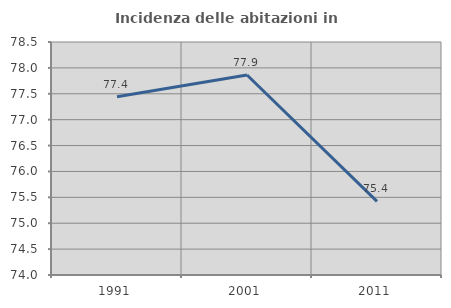
| Category | Incidenza delle abitazioni in proprietà  |
|---|---|
| 1991.0 | 77.444 |
| 2001.0 | 77.864 |
| 2011.0 | 75.423 |